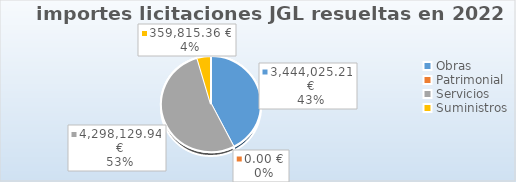
| Category | Series 0 |
|---|---|
| Obras | 3444025.21 |
| Patrimonial | 0 |
| Servicios | 4298129.94 |
| Suministros | 359815.36 |